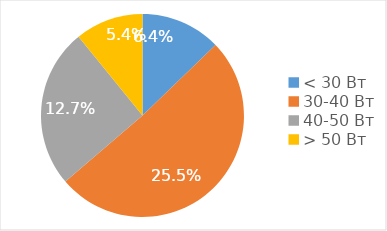
| Category | Доля, % |
|---|---|
| < 30 Вт | 0.064 |
| 30-40 Вт | 0.255 |
| 40-50 Вт | 0.127 |
| > 50 Вт | 0.054 |